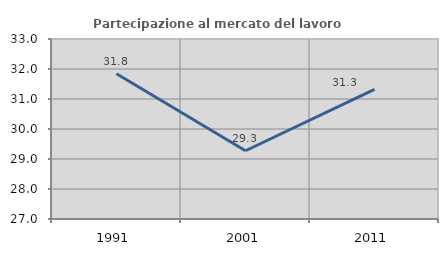
| Category | Partecipazione al mercato del lavoro  femminile |
|---|---|
| 1991.0 | 31.841 |
| 2001.0 | 29.275 |
| 2011.0 | 31.319 |